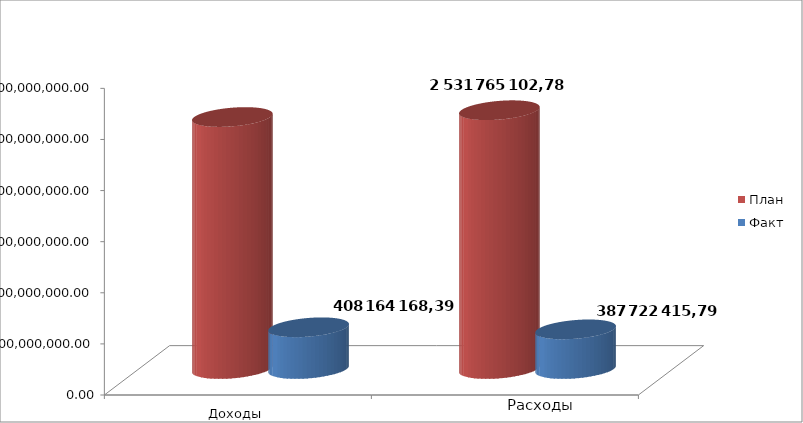
| Category | План | Факт |
|---|---|---|
| 0 | 2465228088.92 | 408164168.39 |
| 1 | 2531765102.78 | 387722415.79 |